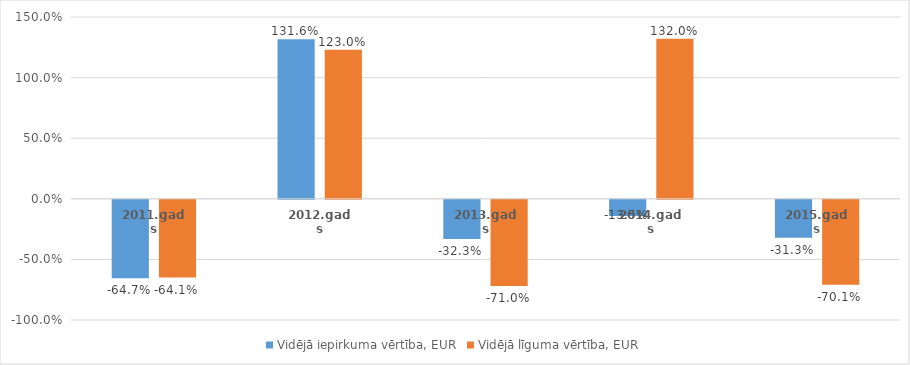
| Category | Vidējā iepirkuma vērtība, EUR | Vidējā līguma vērtība, EUR |
|---|---|---|
| 2011.gads | -0.647 | -0.641 |
| 2012.gads | 1.316 | 1.23 |
| 2013.gads | -0.323 | -0.71 |
| 2014.gads | -0.135 | 1.32 |
| 2015.gads | -0.313 | -0.701 |